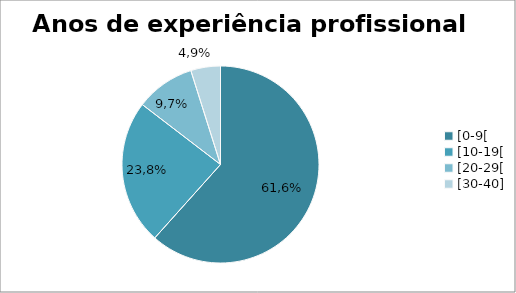
| Category | anos de experiencia profissional |
|---|---|
| [0-9[ | 61.622 |
| [10-19[ | 23.784 |
| [20-29[ | 9.73 |
| [30-40] | 4.865 |